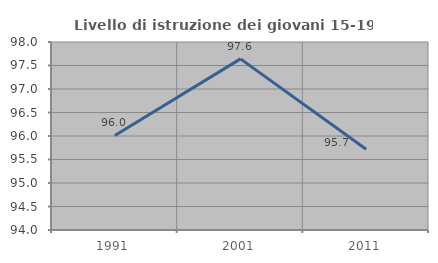
| Category | Livello di istruzione dei giovani 15-19 anni |
|---|---|
| 1991.0 | 96.012 |
| 2001.0 | 97.642 |
| 2011.0 | 95.72 |